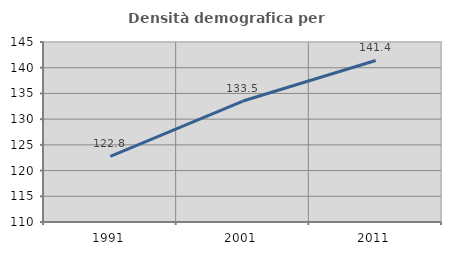
| Category | Densità demografica |
|---|---|
| 1991.0 | 122.781 |
| 2001.0 | 133.522 |
| 2011.0 | 141.41 |